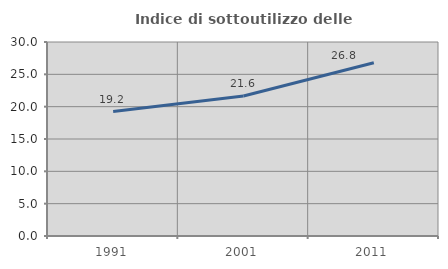
| Category | Indice di sottoutilizzo delle abitazioni  |
|---|---|
| 1991.0 | 19.243 |
| 2001.0 | 21.644 |
| 2011.0 | 26.784 |